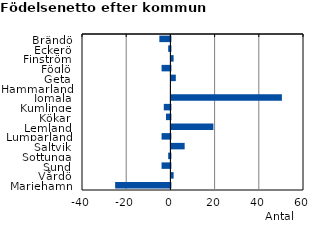
| Category | Series 0 |
|---|---|
| Brändö | -5 |
| Eckerö | -1 |
| Finström | 1 |
| Föglö | -4 |
| Geta | 2 |
| Hammarland | 0 |
| Jomala | 50 |
| Kumlinge | -3 |
| Kökar | -2 |
| Lemland | 19 |
| Lumparland | -4 |
| Saltvik | 6 |
| Sottunga | -1 |
| Sund | -4 |
| Vårdö | 1 |
| Mariehamn | -25 |